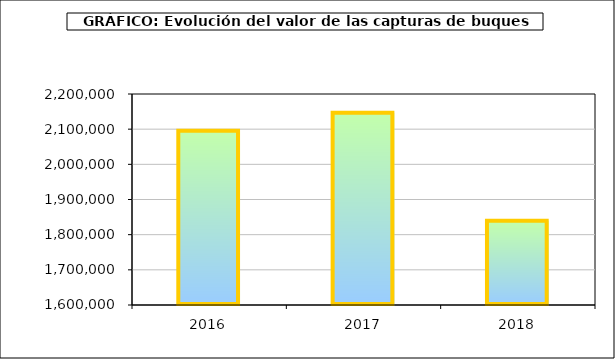
| Category | Series1 |
|---|---|
| 2016.0 | 2095551.387 |
| 2017.0 | 2147014.107 |
| 2018.0 | 1839877.98 |